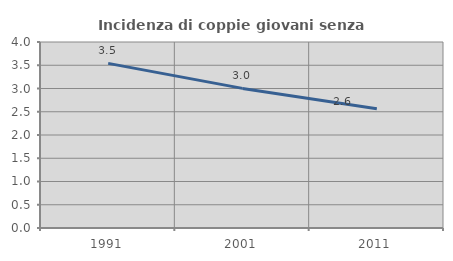
| Category | Incidenza di coppie giovani senza figli |
|---|---|
| 1991.0 | 3.54 |
| 2001.0 | 3.002 |
| 2011.0 | 2.564 |